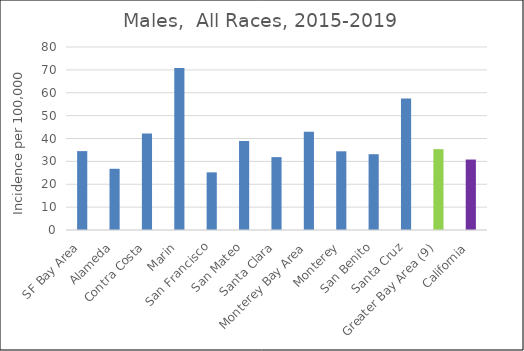
| Category | Male |
|---|---|
| SF Bay Area | 34.49 |
|   Alameda | 26.76 |
|   Contra Costa | 42.19 |
|   Marin | 70.77 |
|   San Francisco | 25.2 |
|   San Mateo | 38.96 |
|   Santa Clara | 31.86 |
| Monterey Bay Area | 42.92 |
|   Monterey | 34.4 |
|   San Benito | 33.13 |
|   Santa Cruz | 57.5 |
| Greater Bay Area (9) | 35.34 |
| California | 30.8 |